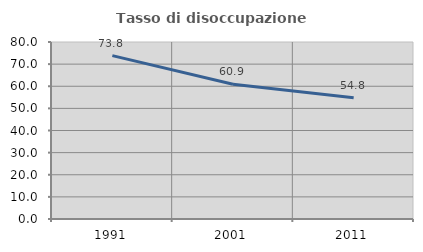
| Category | Tasso di disoccupazione giovanile  |
|---|---|
| 1991.0 | 73.837 |
| 2001.0 | 60.938 |
| 2011.0 | 54.839 |